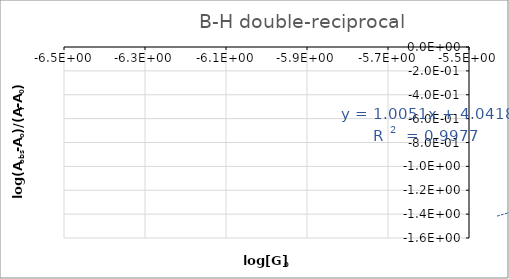
| Category | 405 nm |
|---|---|
| -5.4297393639893246 | -1.395 |
| -5.0214993986774745 | -1.019 |
| -4.935584769970881 | -0.935 |
| -4.798295594976152 | -0.791 |
| -4.666311370426387 | -0.647 |
| -4.648702425368192 | -0.642 |
| -4.515925511605608 | -0.502 |
| -4.419439407349512 | -0.389 |
| -4.258305463046316 | -0.185 |
| -4.007477913175721 | 0 |
| -4.007477913175721 | 0 |